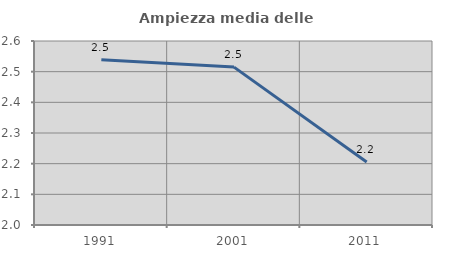
| Category | Ampiezza media delle famiglie |
|---|---|
| 1991.0 | 2.539 |
| 2001.0 | 2.515 |
| 2011.0 | 2.205 |